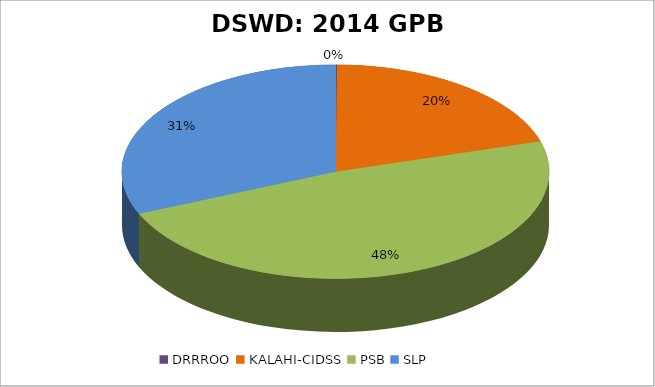
| Category | Series 0 |
|---|---|
| DRRROO | 4 |
| KALAHI-CIDSS | 697 |
| PSB | 1653 |
| SLP | 1081 |